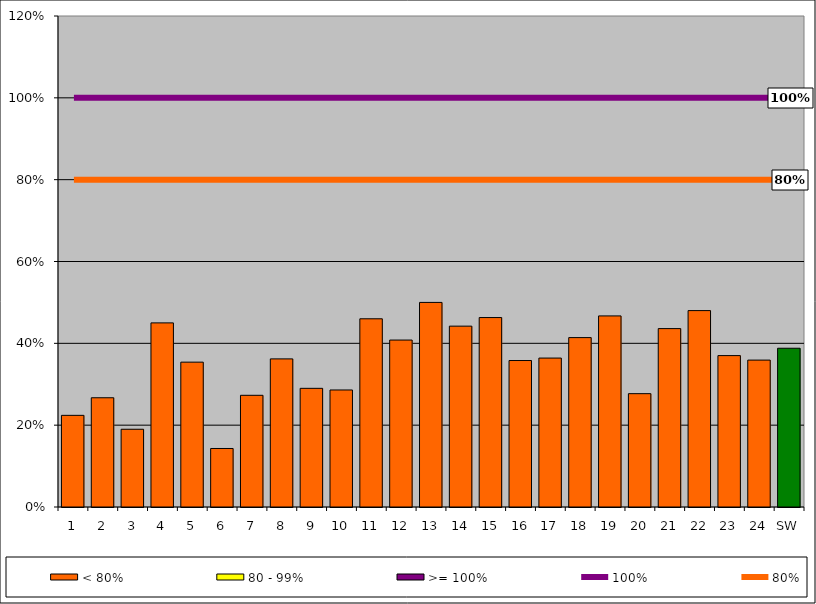
| Category | < 80% | 80 - 99% | >= 100% |
|---|---|---|---|
| 1 | 0.224 | 0 | 0 |
| 2 | 0.267 | 0 | 0 |
| 3 | 0.19 | 0 | 0 |
| 4 | 0.45 | 0 | 0 |
| 5 | 0.354 | 0 | 0 |
| 6 | 0.143 | 0 | 0 |
| 7 | 0.273 | 0 | 0 |
| 8 | 0.362 | 0 | 0 |
| 9 | 0.29 | 0 | 0 |
| 10 | 0.286 | 0 | 0 |
| 11 | 0.46 | 0 | 0 |
| 12 | 0.408 | 0 | 0 |
| 13 | 0.5 | 0 | 0 |
| 14 | 0.442 | 0 | 0 |
| 15 | 0.463 | 0 | 0 |
| 16 | 0.358 | 0 | 0 |
| 17 | 0.364 | 0 | 0 |
| 18 | 0.414 | 0 | 0 |
| 19 | 0.467 | 0 | 0 |
| 20 | 0.277 | 0 | 0 |
| 21 | 0.436 | 0 | 0 |
| 22 | 0.48 | 0 | 0 |
| 23 | 0.37 | 0 | 0 |
| 24 | 0.359 | 0 | 0 |
| SW | 0.388 | 0 | 0 |